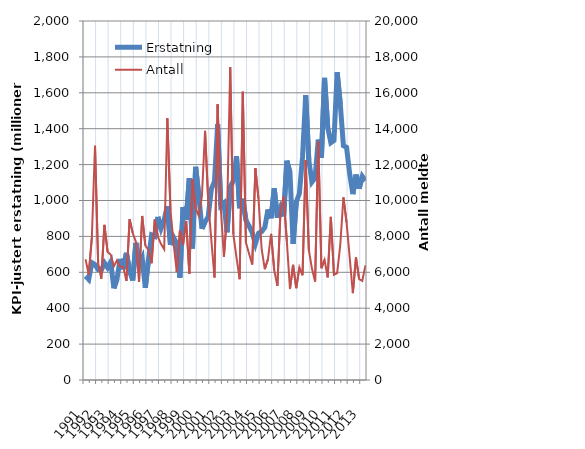
| Category | Erstatning |
|---|---|
| 1991.0 | 579.236 |
| nan | 560.347 |
| nan | 653.814 |
| nan | 642.701 |
| 1992.0 | 614.952 |
| nan | 611.025 |
| nan | 652.408 |
| nan | 626.247 |
| 1993.0 | 657.585 |
| nan | 510.694 |
| nan | 563.454 |
| nan | 674.327 |
| 1994.0 | 617.436 |
| nan | 708.299 |
| nan | 607.065 |
| nan | 554.264 |
| 1995.0 | 763.921 |
| nan | 645.689 |
| nan | 681.297 |
| nan | 513.793 |
| 1996.0 | 669.415 |
| nan | 808.711 |
| nan | 800.646 |
| nan | 908.475 |
| 1997.0 | 844.984 |
| nan | 893.574 |
| nan | 968.756 |
| nan | 753.146 |
| 1998.0 | 793.428 |
| nan | 760.328 |
| nan | 569.839 |
| nan | 963.774 |
| 1999.0 | 892.976 |
| nan | 1124.486 |
| nan | 732.584 |
| nan | 1187.678 |
| 2000.0 | 1029.97 |
| nan | 842.91 |
| nan | 881.241 |
| nan | 909.465 |
| 2001.0 | 1063.079 |
| nan | 1106.589 |
| nan | 1424.857 |
| nan | 971.054 |
| 2002.0 | 986.281 |
| nan | 823.161 |
| nan | 1074.099 |
| nan | 1110.981 |
| 2003.0 | 1246.58 |
| nan | 956.892 |
| nan | 1010.101 |
| nan | 889.576 |
| 2004.0 | 857.951 |
| nan | 820.729 |
| nan | 758.98 |
| nan | 817.677 |
| 2005.0 | 826.537 |
| nan | 850.336 |
| nan | 949.939 |
| nan | 901.449 |
| 2006.0 | 1067.428 |
| nan | 904.085 |
| nan | 958.783 |
| nan | 912.071 |
| 2007.0 | 1221.405 |
| nan | 1157.053 |
| nan | 758.06 |
| nan | 991.7 |
| 2008.0 | 1038.696 |
| nan | 1242.699 |
| nan | 1586.727 |
| nan | 1222.326 |
| 2009.0 | 1103.655 |
| nan | 1126.779 |
| nan | 1339.253 |
| nan | 1237.402 |
| 2010.0 | 1683.084 |
| nan | 1408.498 |
| nan | 1322.431 |
| nan | 1335.187 |
| 2011.0 | 1714.356 |
| nan | 1538.082 |
| nan | 1305.267 |
| nan | 1295.738 |
| 2012.0 | 1147.694 |
| nan | 1035.433 |
| nan | 1144.252 |
| nan | 1066.144 |
| 2013.0 | 1134.371 |
| nan | 1109.226 |